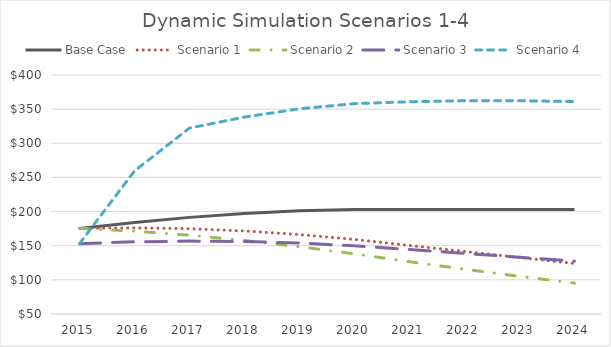
| Category | Base Case | Scenario 1 | Scenario 2 | Scenario 3 | Scenario 4 |
|---|---|---|---|---|---|
| 2015.0 | 175.364 | 175.364 | 175.364 | 153 | 153 |
| 2016.0 | 184.133 | 176.157 | 171.326 | 155.71 | 259.517 |
| 2017.0 | 191.498 | 174.908 | 165.389 | 156.793 | 322.298 |
| 2018.0 | 197.243 | 171.611 | 157.709 | 156.185 | 338.4 |
| 2019.0 | 201.188 | 166.329 | 148.5 | 153.871 | 350.485 |
| 2020.0 | 203.2 | 159.19 | 138.022 | 149.894 | 358.079 |
| 2021.0 | 203.2 | 150.388 | 126.571 | 144.345 | 360.863 |
| 2022.0 | 203.2 | 141.586 | 115.62 | 138.756 | 362.308 |
| 2023.0 | 203.2 | 132.784 | 105.155 | 133.117 | 362.374 |
| 2024.0 | 203.2 | 123.982 | 95.166 | 127.416 | 361.011 |